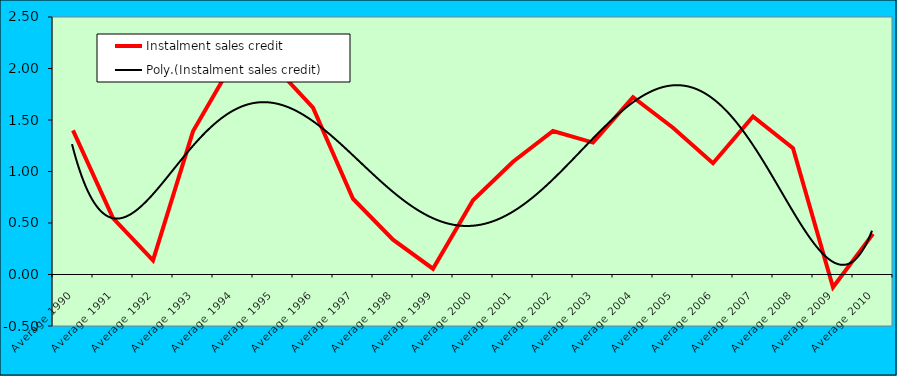
| Category | Instalment sales credit |
|---|---|
| Average 1990 | 1.399 |
| Average 1991 | 0.547 |
| Average 1992 | 0.138 |
| Average 1993 | 1.39 |
| Average 1994 | 2.061 |
| Average 1995 | 2.036 |
| Average 1996 | 1.619 |
| Average 1997 | 0.735 |
| Average 1998 | 0.338 |
| Average 1999 | 0.056 |
| Average 2000 | 0.72 |
| Average 2001 | 1.095 |
| Average 2002 | 1.394 |
| Average 2003 | 1.281 |
| Average 2004 | 1.721 |
| Average 2005 | 1.425 |
| Average 2006 | 1.08 |
| Average 2007 | 1.535 |
| Average 2008 | 1.227 |
| Average 2009 | -0.124 |
| Average 2010 | 0.394 |